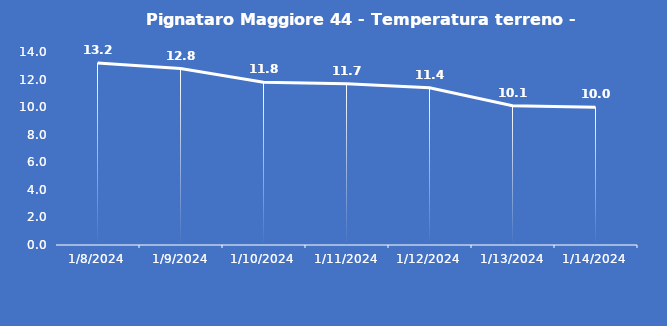
| Category | Pignataro Maggiore 44 - Temperatura terreno - Grezzo (°C) |
|---|---|
| 1/8/24 | 13.2 |
| 1/9/24 | 12.8 |
| 1/10/24 | 11.8 |
| 1/11/24 | 11.7 |
| 1/12/24 | 11.4 |
| 1/13/24 | 10.1 |
| 1/14/24 | 10 |